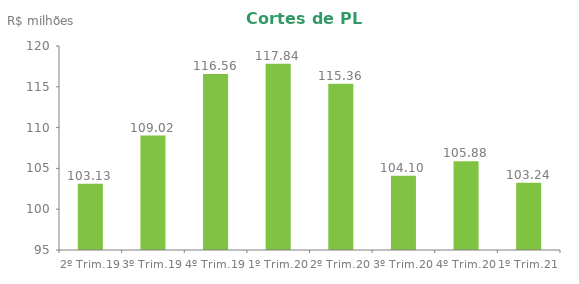
| Category | Series 0 |
|---|---|
| 2º Trim.19 | 103.131 |
| 3º Trim.19 | 109.023 |
| 4º Trim.19 | 116.56 |
| 1º Trim.20 | 117.839 |
| 2º Trim.20 | 115.362 |
| 3º Trim.20 | 104.099 |
| 4º Trim.20 | 105.884 |
| 1º Trim.21 | 103.241 |